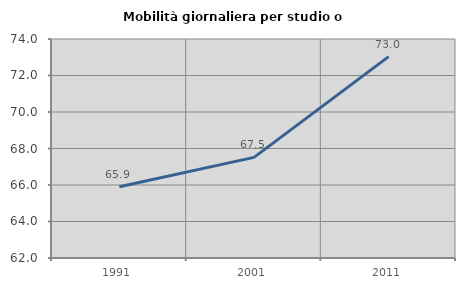
| Category | Mobilità giornaliera per studio o lavoro |
|---|---|
| 1991.0 | 65.901 |
| 2001.0 | 67.513 |
| 2011.0 | 73.036 |